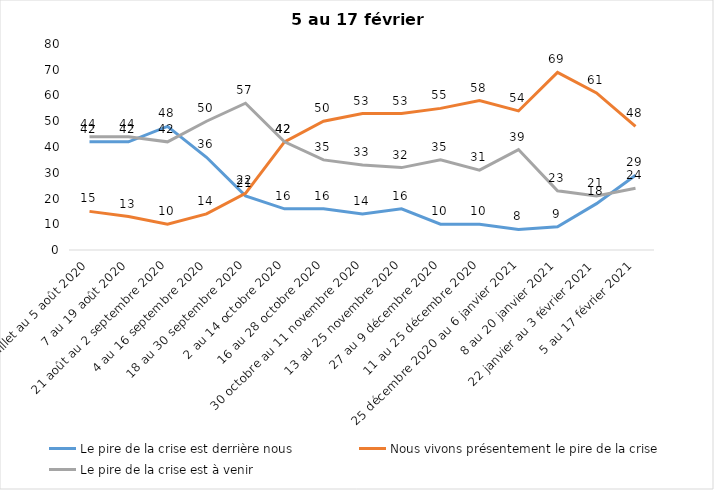
| Category | Le pire de la crise est derrière nous | Nous vivons présentement le pire de la crise | Le pire de la crise est à venir |
|---|---|---|---|
| 24 juillet au 5 août 2020 | 42 | 15 | 44 |
| 7 au 19 août 2020 | 42 | 13 | 44 |
| 21 août au 2 septembre 2020 | 48 | 10 | 42 |
| 4 au 16 septembre 2020 | 36 | 14 | 50 |
| 18 au 30 septembre 2020 | 21 | 22 | 57 |
| 2 au 14 octobre 2020 | 16 | 42 | 42 |
| 16 au 28 octobre 2020 | 16 | 50 | 35 |
| 30 octobre au 11 novembre 2020 | 14 | 53 | 33 |
| 13 au 25 novembre 2020 | 16 | 53 | 32 |
| 27 au 9 décembre 2020 | 10 | 55 | 35 |
| 11 au 25 décembre 2020 | 10 | 58 | 31 |
| 25 décembre 2020 au 6 janvier 2021 | 8 | 54 | 39 |
| 8 au 20 janvier 2021 | 9 | 69 | 23 |
| 22 janvier au 3 février 2021 | 18 | 61 | 21 |
| 5 au 17 février 2021 | 29 | 48 | 24 |